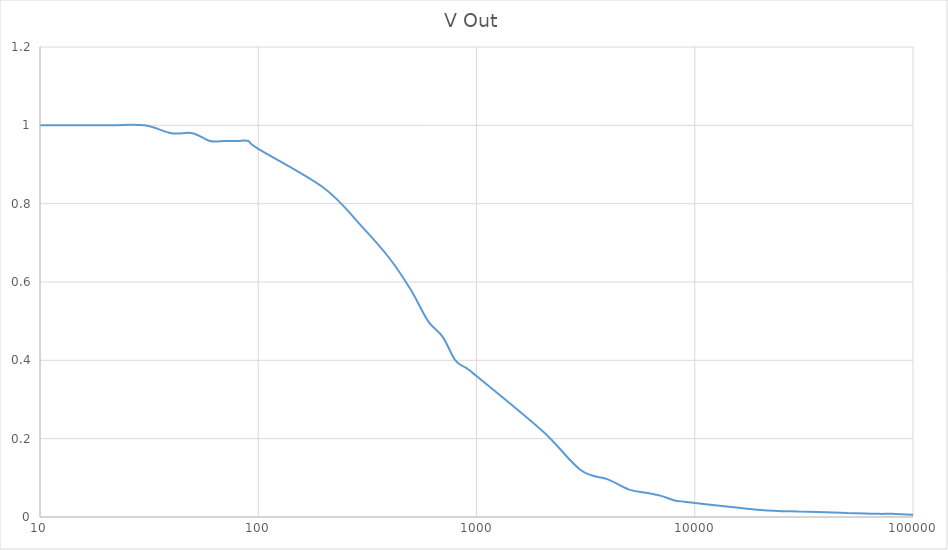
| Category | V Out |
|---|---|
| 10.0 | 1 |
| 20.0 | 1 |
| 30.0 | 1 |
| 40.0 | 0.98 |
| 50.0 | 0.98 |
| 60.0 | 0.96 |
| 70.0 | 0.96 |
| 80.0 | 0.96 |
| 90.0 | 0.96 |
| 100.0 | 0.94 |
| 200.0 | 0.84 |
| 300.0 | 0.74 |
| 400.0 | 0.66 |
| 500.0 | 0.58 |
| 600.0 | 0.5 |
| 700.0 | 0.46 |
| 800.0 | 0.4 |
| 900.0 | 0.38 |
| 1000.0 | 0.36 |
| 2000.0 | 0.22 |
| 3000.0 | 0.12 |
| 4000.0 | 0.096 |
| 5000.0 | 0.07 |
| 6000.0 | 0.062 |
| 7000.0 | 0.054 |
| 8000.0 | 0.043 |
| 9000.0 | 0.039 |
| 10000.0 | 0.036 |
| 20000.0 | 0.018 |
| 30000.0 | 0.014 |
| 40000.0 | 0.012 |
| 50000.0 | 0.01 |
| 60000.0 | 0.009 |
| 70000.0 | 0.008 |
| 80000.0 | 0.008 |
| 90000.0 | 0.007 |
| 100000.0 | 0.006 |